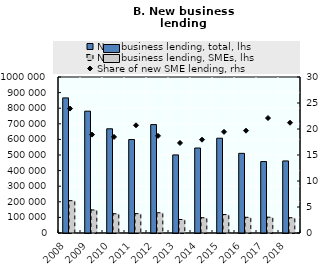
| Category | New business lending, total, lhs | New business lending, SMEs, lhs |
|---|---|---|
| 2008.0 | 866109 | 207237 |
| 2009.0 | 780874 | 147740 |
| 2010.0 | 667977 | 123398 |
| 2011.0 | 599089 | 124117 |
| 2012.0 | 694944 | 129830 |
| 2013.0 | 500502 | 86660 |
| 2014.0 | 544725 | 97764 |
| 2015.0 | 607585 | 118217 |
| 2016.0 | 510582 | 100464 |
| 2017.0 | 457935 | 101243 |
| 2018.0 | 461843.1 | 97925.1 |